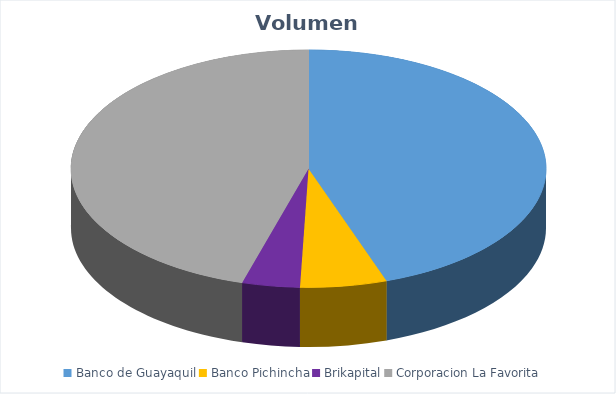
| Category | VOLUMEN ($USD) |
|---|---|
| Banco de Guayaquil | 22761.9 |
| Banco Pichincha | 3000 |
| Brikapital | 2000 |
| Corporacion La Favorita | 23179.71 |